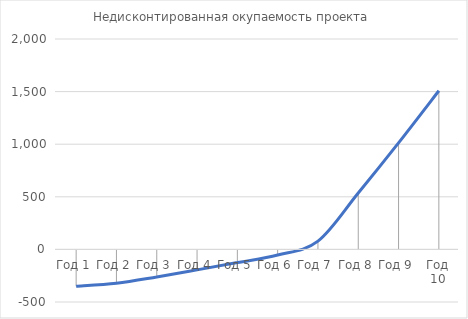
| Category | Недисконтированная окупаемость проекта |
|---|---|
| Год 1 | -350 |
| Год 2 | -321.609 |
| Год 3 | -261.808 |
| Год 4 | -194.654 |
| Год 5 | -125.317 |
| Год 6 | -53.737 |
| Год 7 | 78.778 |
| Год 8 | 536.513 |
| Год 9 | 1012.67 |
| Год 10 | 1507.955 |